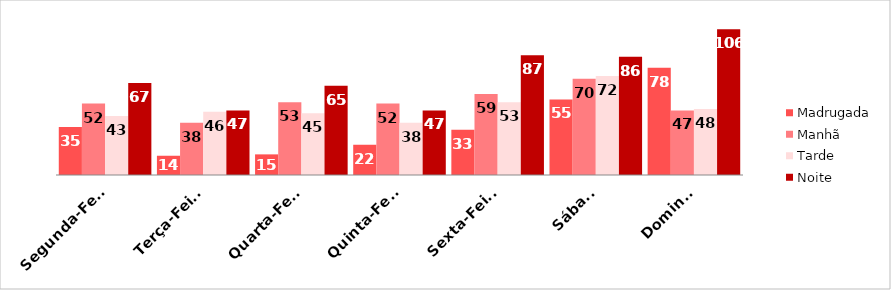
| Category | Madrugada | Manhã | Tarde | Noite |
|---|---|---|---|---|
| Segunda-Feira | 35 | 52 | 43 | 67 |
| Terça-Feira | 14 | 38 | 46 | 47 |
| Quarta-Feira | 15 | 53 | 45 | 65 |
| Quinta-Feira | 22 | 52 | 38 | 47 |
| Sexta-Feira | 33 | 59 | 53 | 87 |
| Sábado | 55 | 70 | 72 | 86 |
| Domingo | 78 | 47 | 48 | 106 |